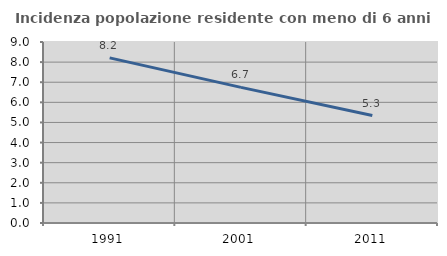
| Category | Incidenza popolazione residente con meno di 6 anni |
|---|---|
| 1991.0 | 8.209 |
| 2001.0 | 6.743 |
| 2011.0 | 5.342 |